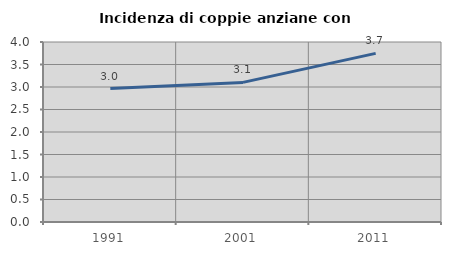
| Category | Incidenza di coppie anziane con figli |
|---|---|
| 1991.0 | 2.966 |
| 2001.0 | 3.102 |
| 2011.0 | 3.747 |